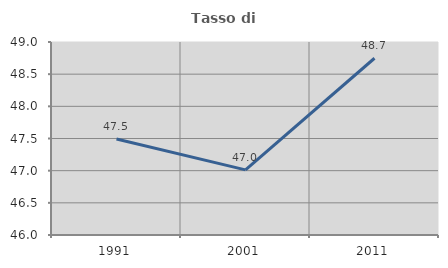
| Category | Tasso di occupazione   |
|---|---|
| 1991.0 | 47.491 |
| 2001.0 | 47.012 |
| 2011.0 | 48.747 |